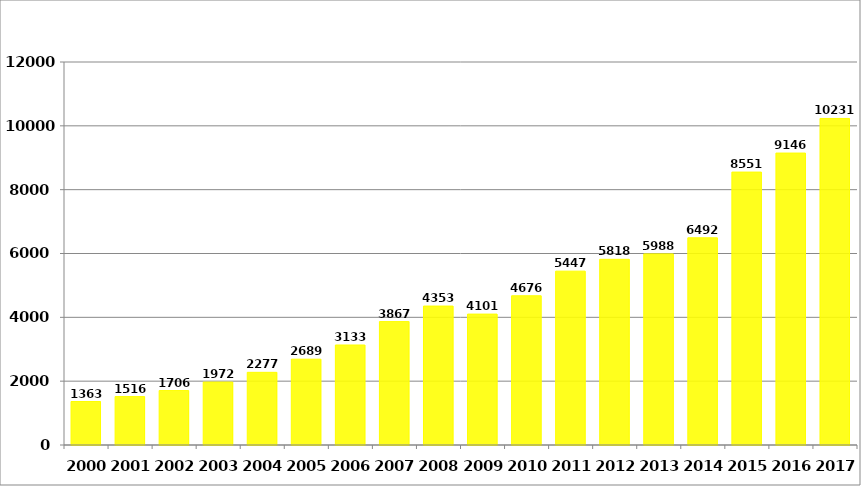
| Category | მშპ ერთ სულზე (ლარი) |
|---|---|
| 2000.0 | 1362.522 |
| 2001.0 | 1516.335 |
| 2002.0 | 1705.599 |
| 2003.0 | 1972.112 |
| 2004.0 | 2276.672 |
| 2005.0 | 2689.099 |
| 2006.0 | 3133.145 |
| 2007.0 | 3866.88 |
| 2008.0 | 4352.902 |
| 2009.0 | 4101.326 |
| 2010.0 | 4675.72 |
| 2011.0 | 5447.057 |
| 2012.0 | 5818.055 |
| 2013.0 | 5987.634 |
| 2014.0 | 6491.589 |
| 2015.0 | 8550.921 |
| 2016.0 | 9146.45 |
| 2017.0 | 10231.4 |